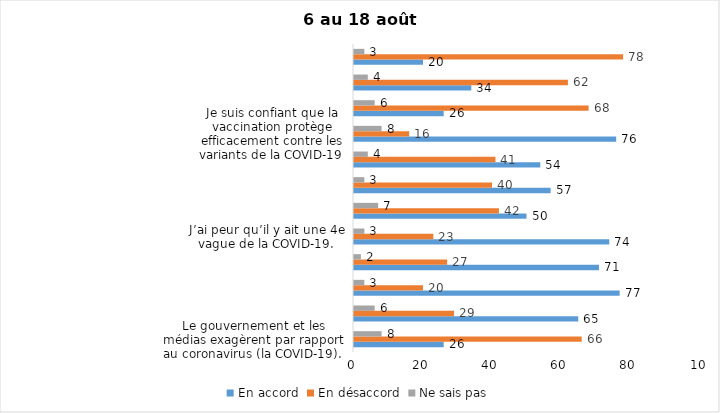
| Category | En accord | En désaccord | Ne sais pas |
|---|---|---|---|
| Le gouvernement et les médias exagèrent par rapport au coronavirus (la COVID-19). | 26 | 66 | 8 |
| J’ai peur que le système de santé soit débordé par les cas de COVID-19 suite au "déconfinement" | 65 | 29 | 6 |
| Je suis favorable au passeport vaccinal qui permettrait l'accès à certains lieux ou activités aux personnes vaccinées. | 77 | 20 | 3 |
| Malgré la levée des mesures de confinement, je préfère limiter mes contacts avec d’autres personnes (par ex., en évitant les activités sociales et de groupes) | 71 | 27 | 2 |
| J’ai peur qu’il y ait une 4e vague de la COVID-19. | 74 | 23 | 3 |
| Dans les régions en zone verte, le risque d’attraper la COVID-19 est minime. | 50 | 42 | 7 |
| Si les cas de COVID-19 augmentent cet automne, je suis favorable à la mise en place de mesures de confinement (ex. fermeture de services non essentiels, interdiction des rassemblements privés) | 57 | 40 | 3 |
| Je suis inquiet de contracter le variant Delta de la Covid-19 | 54 | 41 | 4 |
| Je suis confiant que la vaccination protège efficacement contre les variants de la COVID-19 | 76 | 16 | 8 |
| En raison de la baisse des cas de COID-19 je pense que le gouvernement du Québec devrait mettre fin à l’état d’urgence sanitaire | 26 | 68 | 6 |
| Je suis favorable à ce que le port du masque ne soit plus obligatoire au Québec. | 34 | 62 | 4 |
| Étant donné la progression de la vaccination, je pense qu’il est moins important de suivre les mesures de prévention. | 20 | 78 | 3 |